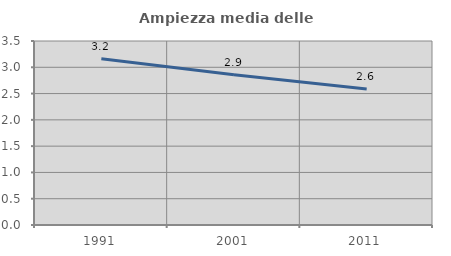
| Category | Ampiezza media delle famiglie |
|---|---|
| 1991.0 | 3.164 |
| 2001.0 | 2.858 |
| 2011.0 | 2.589 |